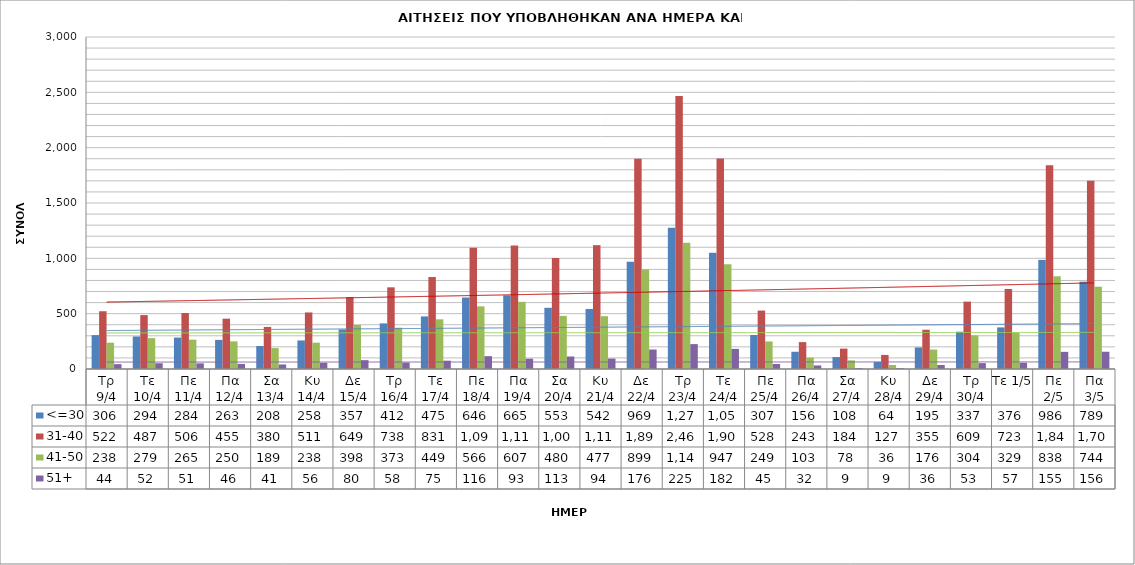
| Category | <=30 | 31-40 | 41-50 | 51+ |
|---|---|---|---|---|
| Τρ 9/4 | 306 | 522 | 238 | 44 |
| Τε 10/4 | 294 | 487 | 279 | 52 |
| Πε 11/4 | 284 | 506 | 265 | 51 |
| Πα 12/4 | 263 | 455 | 250 | 46 |
| Σα 13/4 | 208 | 380 | 189 | 41 |
| Κυ 14/4 | 258 | 511 | 238 | 56 |
| Δε 15/4 | 357 | 649 | 398 | 80 |
| Τρ 16/4 | 412 | 738 | 373 | 58 |
| Τε 17/4 | 475 | 831 | 449 | 75 |
| Πε 18/4 | 646 | 1096 | 566 | 116 |
| Πα 19/4 | 665 | 1117 | 607 | 93 |
| Σα 20/4 | 553 | 1002 | 480 | 113 |
| Κυ 21/4 | 542 | 1119 | 477 | 94 |
| Δε 22/4 | 969 | 1899 | 899 | 176 |
| Τρ 23/4 | 1276 | 2467 | 1140 | 225 |
| Τε 24/4 | 1050 | 1902 | 947 | 182 |
| Πε 25/4 | 307 | 528 | 249 | 45 |
| Πα 26/4 | 156 | 243 | 103 | 32 |
| Σα 27/4 | 108 | 184 | 78 | 9 |
| Κυ 28/4 | 64 | 127 | 36 | 9 |
| Δε 29/4 | 195 | 355 | 176 | 36 |
| Τρ 30/4 | 337 | 609 | 304 | 53 |
| Τε 1/5 | 376 | 723 | 329 | 57 |
| Πε 2/5 | 986 | 1842 | 838 | 155 |
| Πα 3/5 | 789 | 1702 | 744 | 156 |